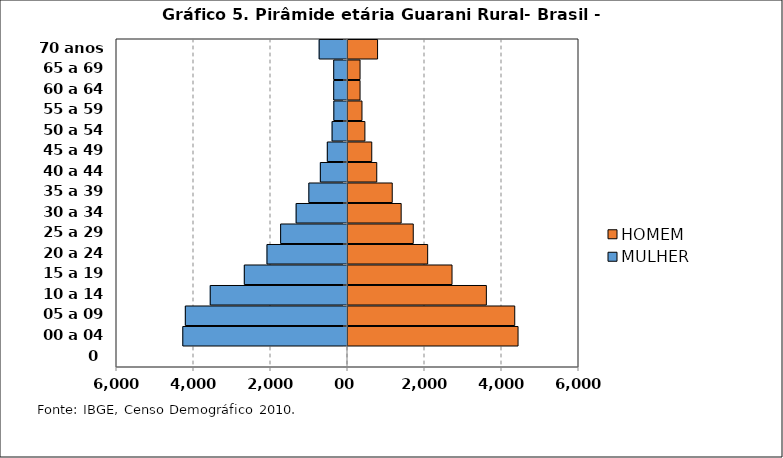
| Category | MULHER | HOMEM |
|---|---|---|
| 0 | 0 | 0 |
| 00 a 04 anos | -4278 | 4417 |
| 05 a 09 anos | -4212 | 4331 |
| 10 a 14 anos | -3565 | 3594 |
| 15 a 19 anos | -2680 | 2702 |
| 20 a 24 anos | -2091 | 2069 |
| 25 a 29 anos | -1737 | 1695 |
| 30 a 34 anos | -1334 | 1381 |
| 35 a 39 anos | -1004 | 1149 |
| 40 a 44 anos | -705 | 747 |
| 45 a 49 anos | -524 | 617 |
| 50 a 54 anos | -400 | 439 |
| 55 a 59 anos | -355 | 363 |
| 60 a 64 anos | -358 | 313 |
| 65 a 69 anos | -358 | 313 |
| 70 anos e + | -736 | 768 |